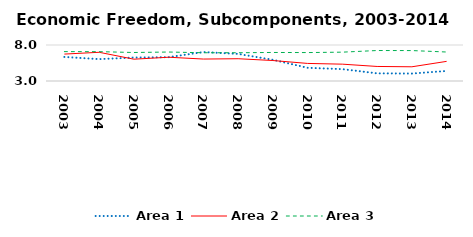
| Category | Area 1 | Area 2 | Area 3 |
|---|---|---|---|
| 2003.0 | 6.341 | 6.738 | 7.08 |
| 2004.0 | 6.039 | 6.987 | 7.075 |
| 2005.0 | 6.257 | 6.029 | 6.958 |
| 2006.0 | 6.31 | 6.301 | 7.023 |
| 2007.0 | 7.02 | 6.048 | 6.923 |
| 2008.0 | 6.764 | 6.094 | 6.926 |
| 2009.0 | 5.944 | 5.844 | 6.963 |
| 2010.0 | 4.834 | 5.441 | 6.949 |
| 2011.0 | 4.647 | 5.337 | 7.006 |
| 2012.0 | 4.065 | 5.02 | 7.233 |
| 2013.0 | 4.034 | 4.974 | 7.226 |
| 2014.0 | 4.395 | 5.728 | 7.027 |